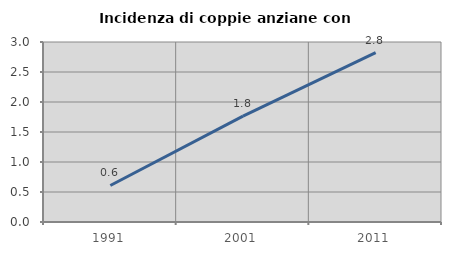
| Category | Incidenza di coppie anziane con figli |
|---|---|
| 1991.0 | 0.609 |
| 2001.0 | 1.765 |
| 2011.0 | 2.823 |